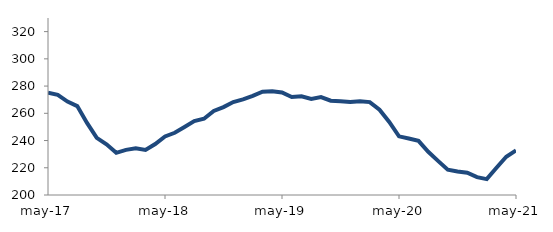
| Category | Series 0 |
|---|---|
| 2017-05-01 | 275.167 |
| 2017-06-01 | 273.53 |
| 2017-07-01 | 268.618 |
| 2017-08-01 | 265.289 |
| 2017-09-01 | 252.912 |
| 2017-10-01 | 242.002 |
| 2017-11-01 | 237.205 |
| 2017-12-01 | 230.992 |
| 2018-01-01 | 233.165 |
| 2018-02-01 | 234.384 |
| 2018-03-01 | 233.06 |
| 2018-04-01 | 237.465 |
| 2018-05-01 | 242.979 |
| 2018-06-01 | 245.679 |
| 2018-07-01 | 249.89 |
| 2018-08-01 | 254.238 |
| 2018-09-01 | 255.99 |
| 2018-10-01 | 261.71 |
| 2018-11-01 | 264.538 |
| 2018-12-01 | 268.288 |
| 2019-01-01 | 270.264 |
| 2019-02-01 | 272.765 |
| 2019-03-01 | 275.922 |
| 2019-04-01 | 276.17 |
| 2019-05-01 | 275.323 |
| 2019-06-01 | 271.933 |
| 2019-07-01 | 272.528 |
| 2019-08-01 | 270.617 |
| 2019-09-01 | 271.909 |
| 2019-10-01 | 269.246 |
| 2019-11-01 | 268.873 |
| 2019-12-01 | 268.319 |
| 2020-01-01 | 268.914 |
| 2020-02-01 | 268.233 |
| 2020-03-01 | 262.58 |
| 2020-04-01 | 253.663 |
| 2020-05-01 | 243.088 |
| 2020-06-01 | 241.541 |
| 2020-07-01 | 239.786 |
| 2020-08-01 | 231.766 |
| 2020-09-01 | 225.047 |
| 2020-10-01 | 218.571 |
| 2020-11-01 | 217.286 |
| 2020-12-01 | 216.368 |
| 2021-01-01 | 213.087 |
| 2021-02-01 | 211.643 |
| 2021-03-01 | 220.04 |
| 2021-04-01 | 228.12 |
| 2021-05-01 | 232.717 |